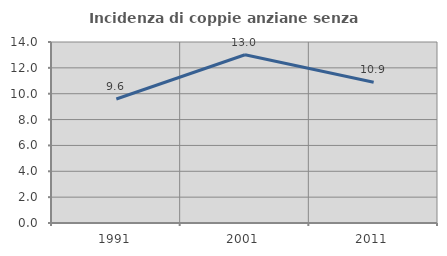
| Category | Incidenza di coppie anziane senza figli  |
|---|---|
| 1991.0 | 9.589 |
| 2001.0 | 13.014 |
| 2011.0 | 10.884 |